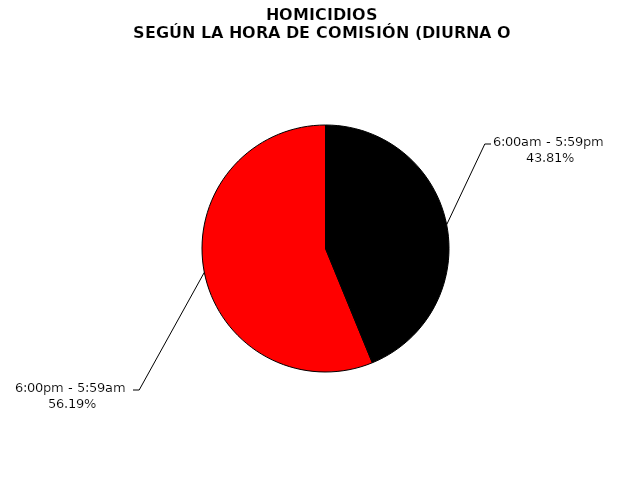
| Category | Series 0 |
|---|---|
| 6:00am - 5:59pm | 1083 |
| 6:00pm - 5:59am | 1389 |